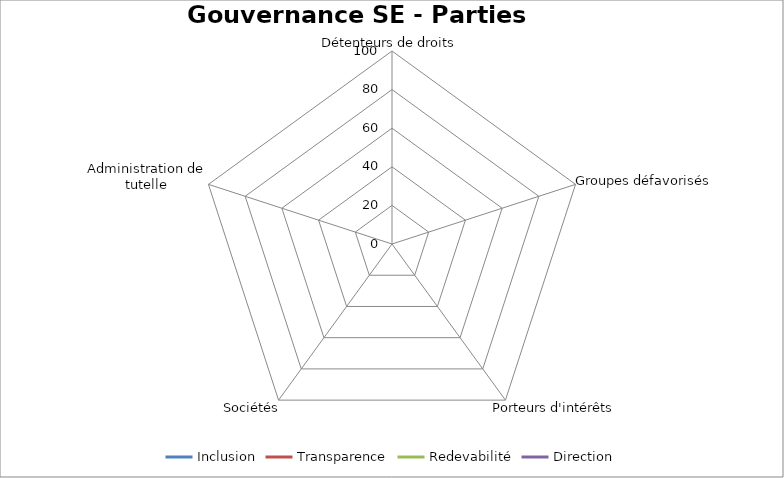
| Category | Inclusion | Transparence | Redevabilité | Direction |
|---|---|---|---|---|
| Détenteurs de droits | 0 | 0 | 0 | 0 |
| Groupes défavorisés | 0 | 0 | 0 | 0 |
| Porteurs d'intérêts | 0 | 0 | 0 | 0 |
| Sociétés | 0 | 0 | 0 | 0 |
| Administration de tutelle | 0 | 0 | 0 | 0 |